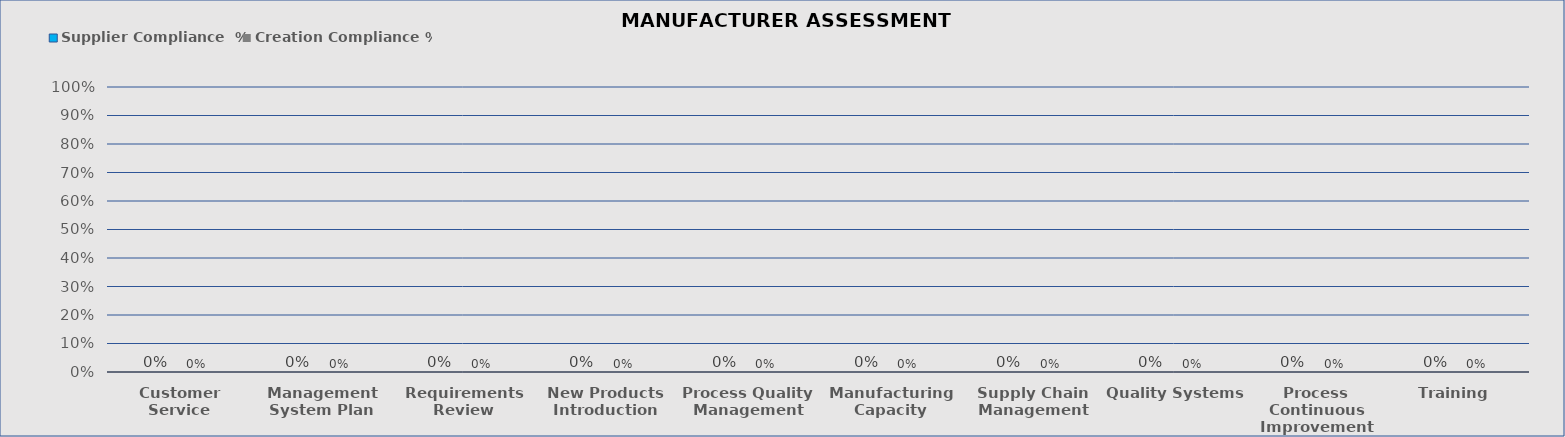
| Category | Supplier Compliance  % | Creation Compliance % |
|---|---|---|
| Customer Service | 0 | 0 |
| Management System Plan | 0 | 0 |
| Requirements Review | 0 | 0 |
| New Products Introduction | 0 | 0 |
| Process Quality Management | 0 | 0 |
| Manufacturing Capacity | 0 | 0 |
| Supply Chain Management | 0 | 0 |
| Quality Systems | 0 | 0 |
| Process Continuous Improvement | 0 | 0 |
| Training  | 0 | 0 |